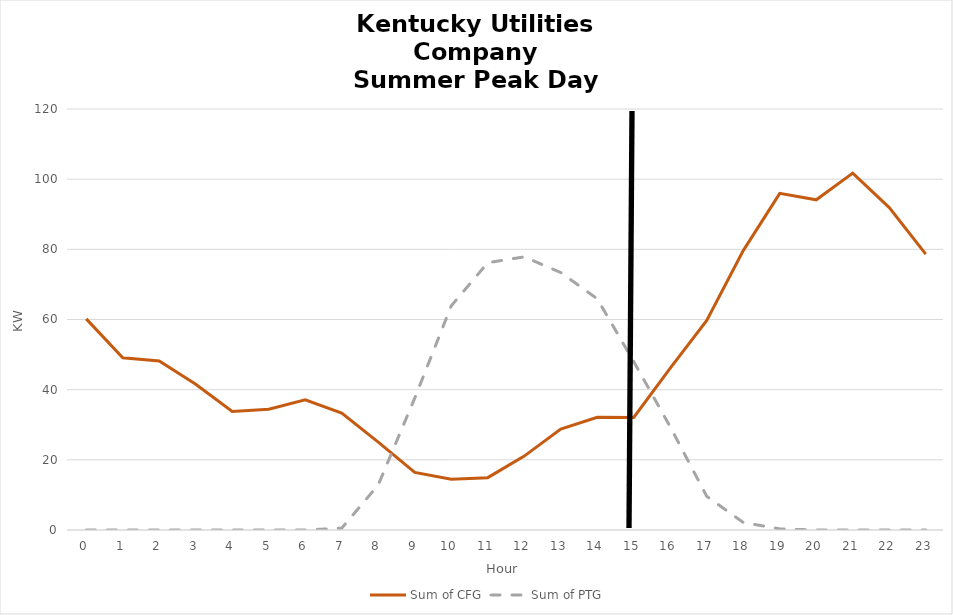
| Category | Sum of CFG | Sum of PTG |
|---|---|---|
| 0.0 | 60.176 | 0 |
| 1.0 | 49.078 | 0 |
| 2.0 | 48.167 | 0 |
| 3.0 | 41.523 | 0 |
| 4.0 | 33.774 | 0 |
| 5.0 | 34.441 | 0 |
| 6.0 | 37.108 | 0 |
| 7.0 | 33.3 | 0.528 |
| 8.0 | 25.051 | 12.856 |
| 9.0 | 16.418 | 37.597 |
| 10.0 | 14.485 | 63.891 |
| 11.0 | 14.919 | 76.194 |
| 12.0 | 21.062 | 77.855 |
| 13.0 | 28.792 | 73.388 |
| 14.0 | 32.111 | 65.896 |
| 15.0 | 32.071 | 47.987 |
| 16.0 | 46.154 | 29.395 |
| 17.0 | 59.764 | 9.604 |
| 18.0 | 79.64 | 2.147 |
| 19.0 | 95.954 | 0.322 |
| 20.0 | 94.112 | 0 |
| 21.0 | 101.716 | 0 |
| 22.0 | 91.904 | 0 |
| 23.0 | 78.628 | 0 |